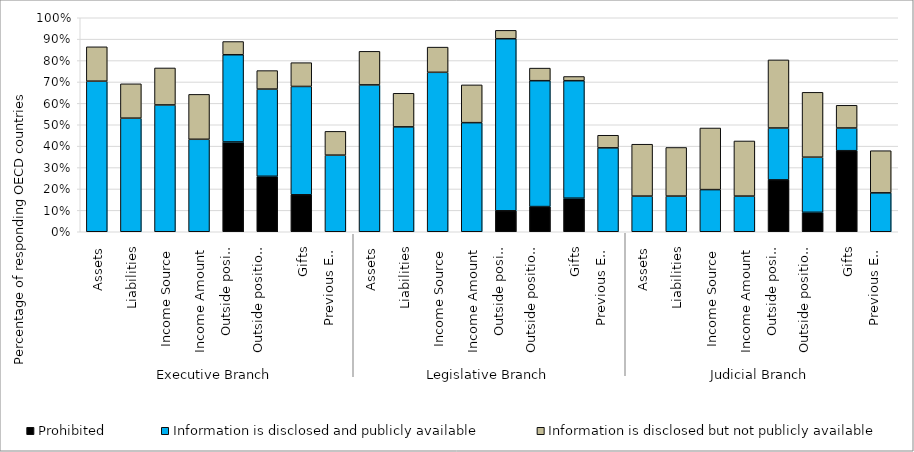
| Category | Prohibited | Information is disclosed and publicly available | Information is disclosed but not publicly available |
|---|---|---|---|
| 0 | 0 | 0.704 | 0.16 |
| 1 | 0 | 0.531 | 0.16 |
| 2 | 0 | 0.593 | 0.173 |
| 3 | 0 | 0.432 | 0.21 |
| 4 | 0.42 | 0.407 | 0.062 |
| 5 | 0.259 | 0.407 | 0.086 |
| 6 | 0.173 | 0.506 | 0.111 |
| 7 | 0 | 0.358 | 0.111 |
| 8 | 0 | 0.686 | 0.157 |
| 9 | 0 | 0.49 | 0.157 |
| 10 | 0 | 0.745 | 0.118 |
| 11 | 0 | 0.51 | 0.176 |
| 12 | 0.098 | 0.804 | 0.039 |
| 13 | 0.118 | 0.588 | 0.059 |
| 14 | 0.157 | 0.549 | 0.02 |
| 15 | 0 | 0.392 | 0.059 |
| 16 | 0 | 0.167 | 0.242 |
| 17 | 0 | 0.167 | 0.227 |
| 18 | 0 | 0.197 | 0.288 |
| 19 | 0 | 0.167 | 0.258 |
| 20 | 0.242 | 0.242 | 0.318 |
| 21 | 0.091 | 0.258 | 0.303 |
| 22 | 0.379 | 0.106 | 0.106 |
| 23 | 0 | 0.182 | 0.197 |